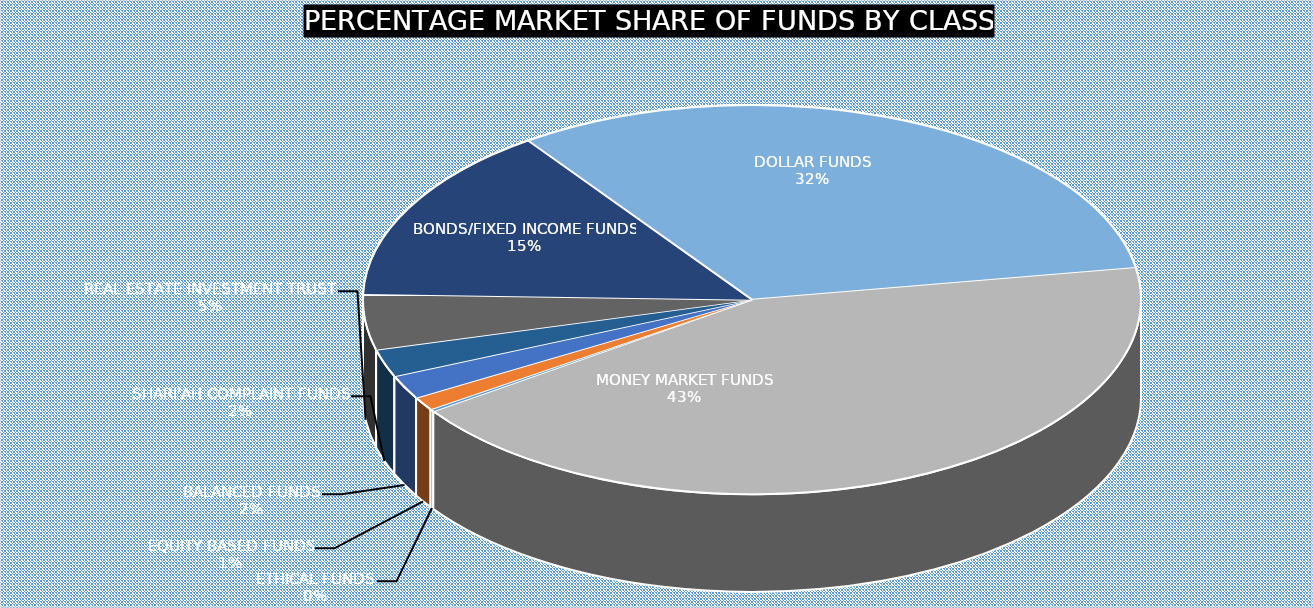
| Category | October 2023 |
|---|---|
| ETHICAL FUNDS | 3894497549.42 |
| EQUITY BASED FUNDS | 22547906750.89 |
| BALANCED FUNDS | 39714521842.85 |
| SHARI'AH COMPLAINT FUNDS | 46293023793.2 |
| REAL ESTATE INVESTMENT TRUST | 92891430368.21 |
| BONDS/FIXED INCOME FUNDS | 297868826945.44 |
| DOLLAR FUNDS | 648612941310.152 |
| MONEY MARKET FUNDS | 864770269550.74 |